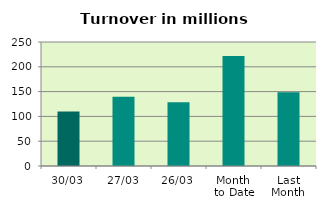
| Category | Series 0 |
|---|---|
| 30/03 | 110.006 |
| 27/03 | 139.43 |
| 26/03 | 128.699 |
| Month 
to Date | 221.728 |
| Last
Month | 148.578 |